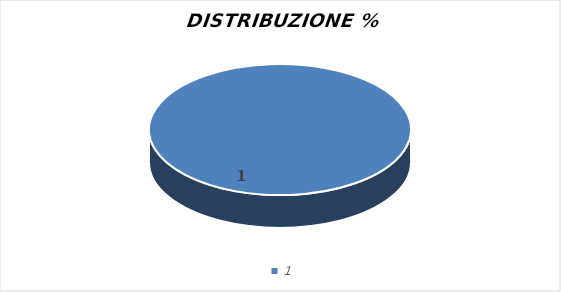
| Category | #RIF! |
|---|---|
| 0 | 1 |